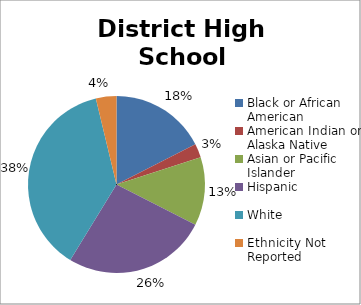
| Category | Series 0 |
|---|---|
| Black or African American | 0.175 |
| American Indian or Alaska Native | 0.025 |
| Asian or Pacific Islander | 0.125 |
| Hispanic | 0.262 |
| White | 0.375 |
| Ethnicity Not Reported | 0.038 |